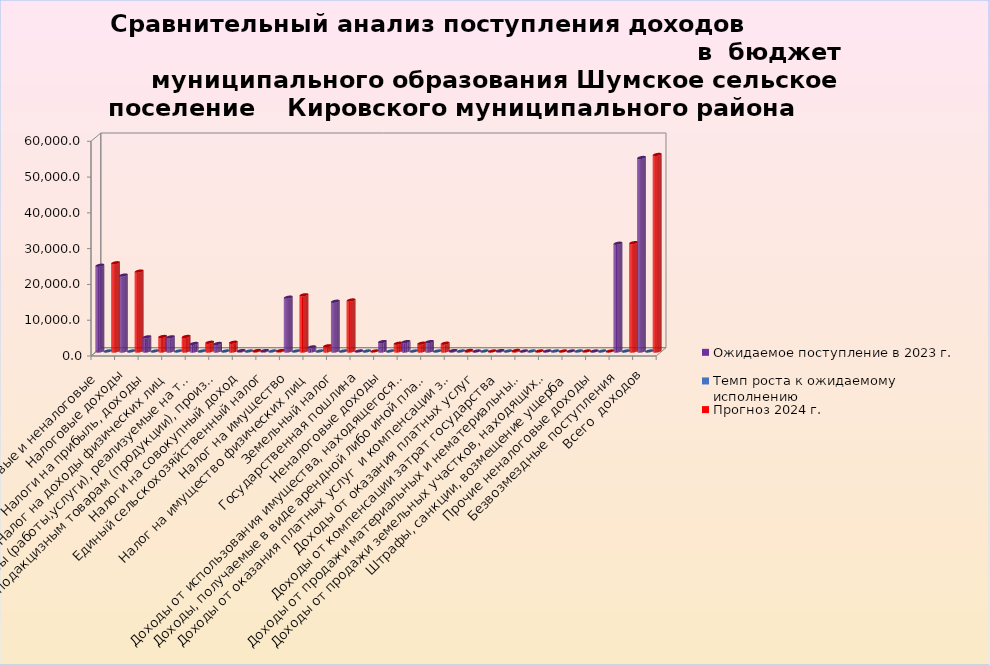
| Category | Ожидаемое поступление в 2023 г. | Темп роста к ожидаемому исполнению | Прогноз 2024 г. |
|---|---|---|---|
| Доходы налоговые и неналоговые | 23962.9 | 1.029 | 24656.3 |
| Налоговые доходы | 21210.6 | 1.053 | 22325.7 |
| Налоги на прибыль, доходы | 3950.4 | 1.026 | 4052.5 |
| Налог на доходы физических лиц | 3950.4 | 1.026 | 4052.5 |
| Налоги на товары (работы,услуги), реализуемые на территории РФ | 2102.5 | 1.162 | 2442.7 |
| Акцизы по подакцизным товарам (продукции), производимым на территории РФ | 2102.5 | 1.162 | 2442.7 |
| Налоги на совокупный доход | 115.5 | 1.039 | 120 |
| Единый сельскохозяйственный налог | 115.5 | 1.039 | 120 |
| Налог на имущество | 15038.2 | 1.044 | 15705.5 |
| Налог на имущество физических лиц | 1138.2 | 1.278 | 1455.1 |
| Земельный налог | 13900 | 1.025 | 14250.4 |
| Государственная пошлина | 4 | 1.25 | 5 |
| Неналоговые доходы | 2625.2 | 0.827 | 2170.6 |
| Доходы от использования имущества, находящегося в государственной и муниципальной собственности | 2625.2 | 0.827 | 2170.6 |
| Доходы, получаемые в виде арендной либо иной платы за передачу в возмездное пользование государственного и муниципального имущества      (за исключением имущества бюджетных и  автономных учреждений, а также имущества государственных и муниципальных унитар | 2625.2 | 0.827 | 2170.6 |
| Доходы от оказания платных услуг  и компенсации затрат государства | 125 | 1.2 | 150 |
| Доходы от оказания платных услуг  | 0 | 0 | 0 |
| Доходы от компенсации затрат государства | 125 | 1.2 | 150 |
| Доходы от продажи материальных и нематериальных активов | 0 | 0 | 0 |
| Доходы от продажи земельных участков, находящихся в государственной и муниципальной собственности (за искл. земельных участков бюджетных и автономных учреждений) | 0 | 0 | 0 |
| Штрафы, санкции, возмещение ущерба | 2.1 | 4.762 | 10 |
| Прочие неналоговые доходы | 0 | 0 | 0 |
| Безвозмездные поступления | 30110.1 | 1.005 | 30273.8 |
| Всего  доходов | 54073 | 1.016 | 54930.1 |